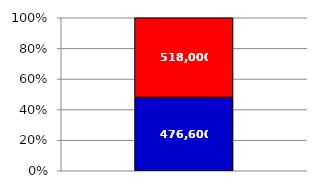
| Category | Series 0 | Series 1 | Series 2 |
|---|---|---|---|
| 0 |  | 476600 | 518000 |